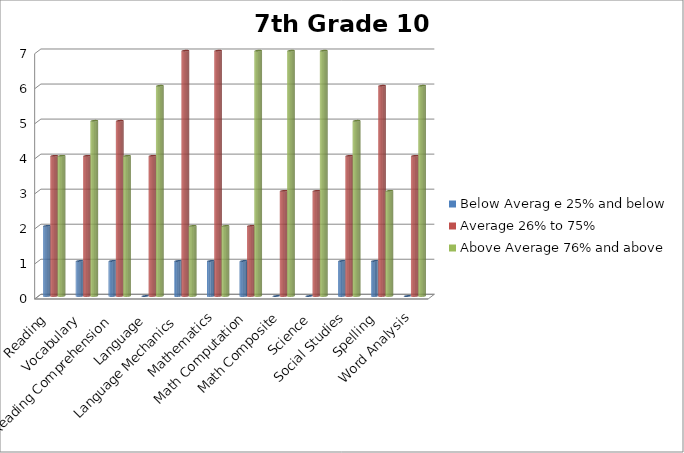
| Category | Below Averag e 25% and below | Average 26% to 75% | Above Average 76% and above |
|---|---|---|---|
| Reading  | 2 | 4 | 4 |
| Vocabulary | 1 | 4 | 5 |
| Reading Comprehension | 1 | 5 | 4 |
| Language | 0 | 4 | 6 |
| Language Mechanics | 1 | 7 | 2 |
| Mathematics | 1 | 7 | 2 |
| Math Computation | 1 | 2 | 7 |
| Math Composite | 0 | 3 | 7 |
| Science | 0 | 3 | 7 |
| Social Studies | 1 | 4 | 5 |
| Spelling | 1 | 6 | 3 |
| Word Analysis | 0 | 4 | 6 |